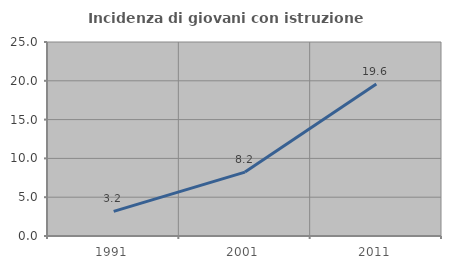
| Category | Incidenza di giovani con istruzione universitaria |
|---|---|
| 1991.0 | 3.165 |
| 2001.0 | 8.234 |
| 2011.0 | 19.595 |